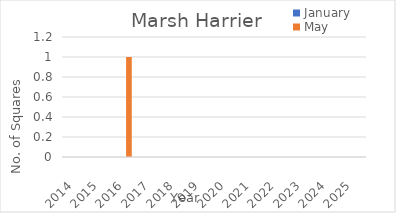
| Category | January | May |
|---|---|---|
| 2014.0 | 0 | 0 |
| 2015.0 | 0 | 0 |
| 2016.0 | 0 | 1 |
| 2017.0 | 0 | 0 |
| 2018.0 | 0 | 0 |
| 2019.0 | 0 | 0 |
| 2020.0 | 0 | 0 |
| 2021.0 | 0 | 0 |
| 2022.0 | 0 | 0 |
| 2023.0 | 0 | 0 |
| 2024.0 | 0 | 0 |
| 2025.0 | 0 | 0 |